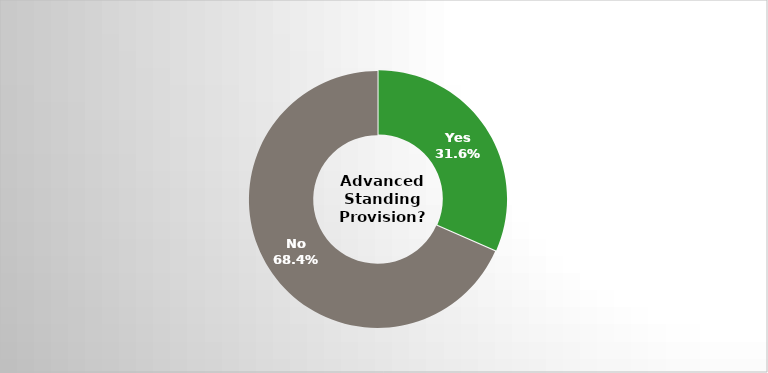
| Category | Series 0 |
|---|---|
| Yes | 0.316 |
| No | 0.684 |